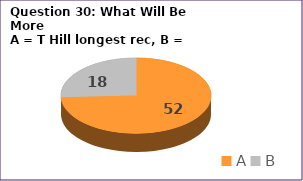
| Category | Series 0 |
|---|---|
| A | 52 |
| B | 18 |